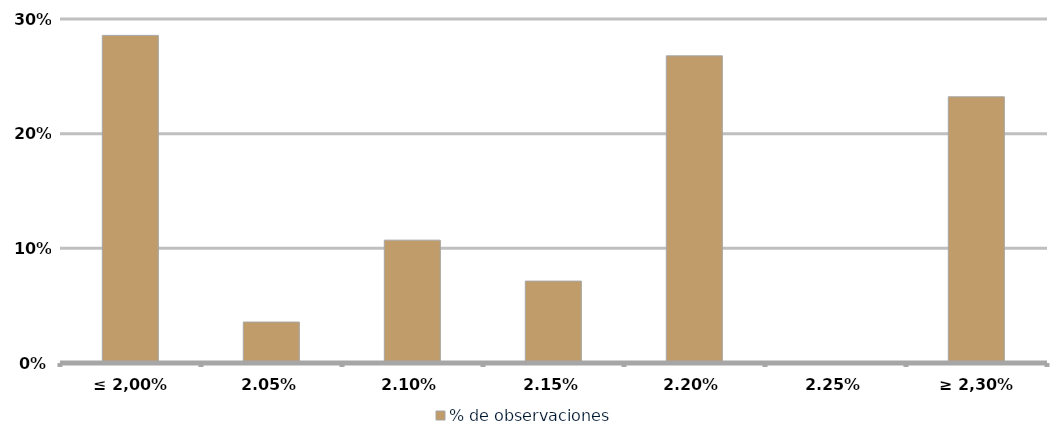
| Category | % de observaciones  |
|---|---|
| ≤ 2,00% | 0.286 |
| 2,05% | 0.036 |
| 2,10% | 0.107 |
| 2,15% | 0.071 |
| 2,20% | 0.268 |
| 2,25% | 0 |
| ≥ 2,30% | 0.232 |